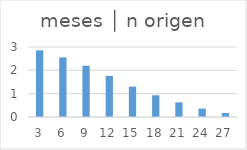
| Category | meses │ n origen |
|---|---|
| 3.0 | 2.857 |
| 6.0 | 2.554 |
| 9.0 | 2.198 |
| 12.0 | 1.763 |
| 15.0 | 1.304 |
| 18.0 | 0.931 |
| 21.0 | 0.629 |
| 24.0 | 0.359 |
| 27.0 | 0.173 |